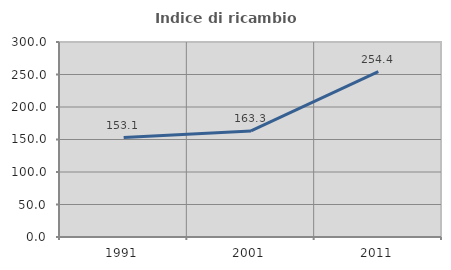
| Category | Indice di ricambio occupazionale  |
|---|---|
| 1991.0 | 153.062 |
| 2001.0 | 163.251 |
| 2011.0 | 254.382 |